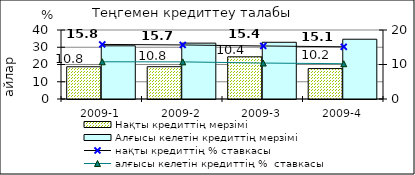
| Category | Нақты кредиттің мерзімі  | Алғысы келетін кредиттің мерзімі  |
|---|---|---|
| 2009-1 | 18.68 | 30.83 |
| 2009-2 | 18.72 | 32.39 |
| 2009-3 | 24.46 | 32.88 |
| 2009-4 | 17.63 | 34.65 |